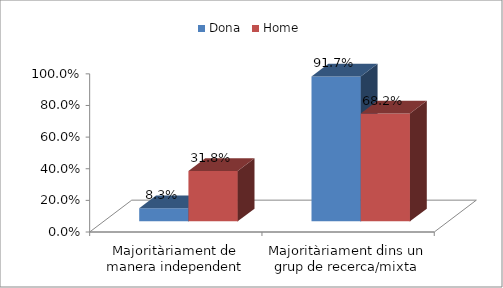
| Category | Dona | Home |
|---|---|---|
| Majoritàriament de manera independent | 0.083 | 0.318 |
| Majoritàriament dins un grup de recerca/mixta | 0.917 | 0.682 |